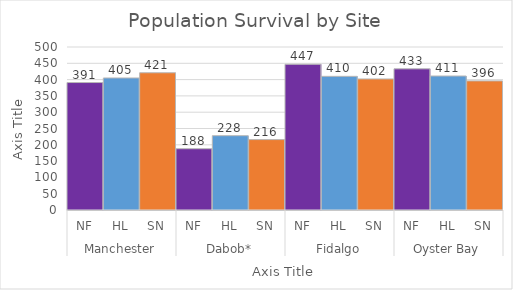
| Category | Total |
|---|---|
| 0 | 391 |
| 1 | 405 |
| 2 | 421 |
| 3 | 188 |
| 4 | 228 |
| 5 | 216 |
| 6 | 447 |
| 7 | 410 |
| 8 | 402 |
| 9 | 433 |
| 10 | 411 |
| 11 | 396 |